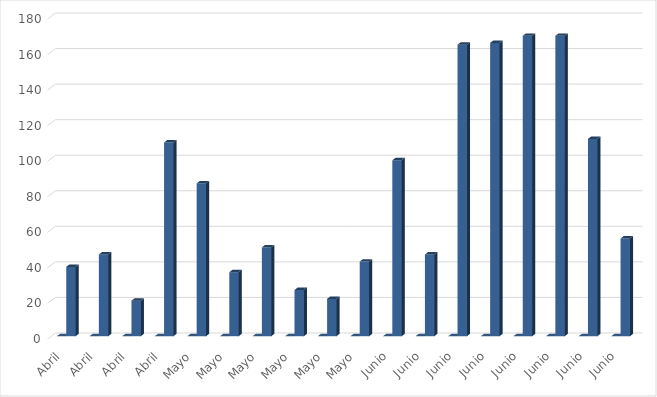
| Category | Series 0 | Series 1 |
|---|---|---|
| Abril | 0 | 39 |
| Abril | 0 | 46 |
| Abril | 0 | 20 |
| Abril | 0 | 109 |
| Mayo | 0 | 86 |
| Mayo | 0 | 36 |
| Mayo | 0 | 50 |
| Mayo | 0 | 26 |
| Mayo | 0 | 21 |
| Mayo | 0 | 42 |
| Junio | 0 | 99 |
| Junio | 0 | 46 |
| Junio | 0 | 164 |
| Junio | 0 | 165 |
| Junio | 0 | 169 |
| Junio | 0 | 169 |
| Junio | 0 | 111 |
| Junio | 0 | 55 |